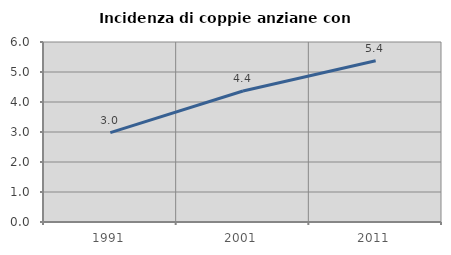
| Category | Incidenza di coppie anziane con figli |
|---|---|
| 1991.0 | 2.98 |
| 2001.0 | 4.366 |
| 2011.0 | 5.378 |